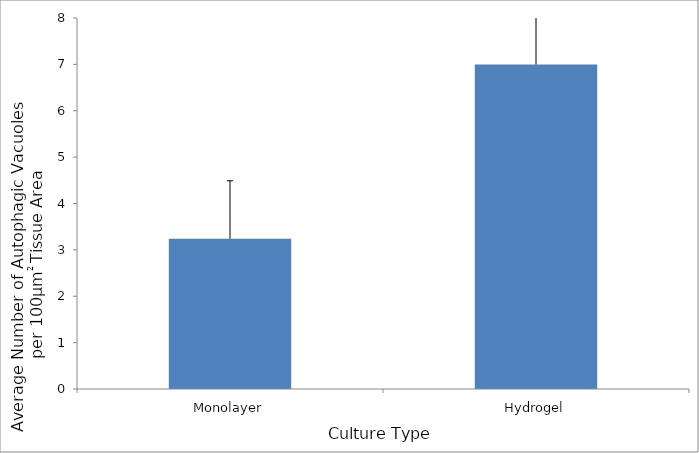
| Category | Average |
|---|---|
| Monolayer | 3.24 |
| Hydrogel | 7 |